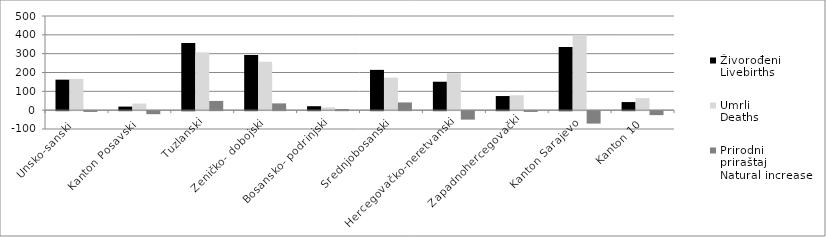
| Category | Živorođeni
Livebirths | Umrli
Deaths | Prirodni
priraštaj
Natural increase |
|---|---|---|---|
| Unsko-sanski  | 162 | 166 | -4 |
| Kanton Posavski  | 19 | 35 | -16 |
| Tuzlanski | 356 | 307 | 49 |
| Zeničko- dobojski | 293 | 257 | 36 |
| Bosansko- podrinjski | 21 | 15 | 6 |
| Srednjobosanski | 214 | 173 | 41 |
| Hercegovačko-neretvanski | 151 | 196 | -45 |
| Zapadnohercegovački | 75 | 79 | -4 |
| Kanton Sarajevo | 335 | 401 | -66 |
| Kanton 10 | 43 | 64 | -21 |